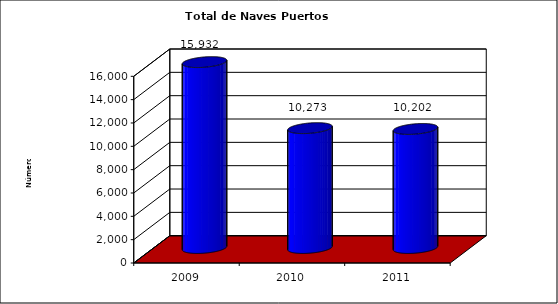
| Category | Series 0 |
|---|---|
| 2009.0 | 15932 |
| 2010.0 | 10273 |
| 2011.0 | 10202 |